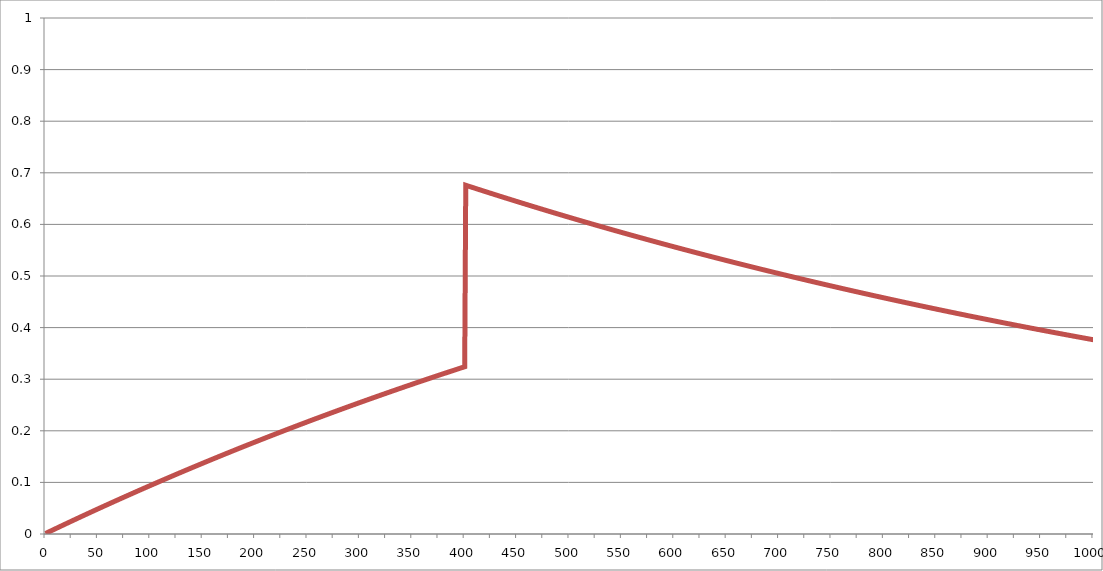
| Category | Series 1 |
|---|---|
| 0.0 | 0.001 |
| 1.0 | 0.002 |
| 2.0 | 0.003 |
| 3.0 | 0.004 |
| 4.0 | 0.005 |
| 5.0 | 0.006 |
| 6.0 | 0.007 |
| 7.0 | 0.008 |
| 8.0 | 0.009 |
| 9.0 | 0.01 |
| 10.0 | 0.011 |
| 11.0 | 0.012 |
| 12.0 | 0.013 |
| 13.0 | 0.014 |
| 14.0 | 0.015 |
| 15.0 | 0.016 |
| 16.0 | 0.016 |
| 17.0 | 0.017 |
| 18.0 | 0.018 |
| 19.0 | 0.019 |
| 20.0 | 0.02 |
| 21.0 | 0.021 |
| 22.0 | 0.022 |
| 23.0 | 0.023 |
| 24.0 | 0.024 |
| 25.0 | 0.025 |
| 26.0 | 0.026 |
| 27.0 | 0.027 |
| 28.0 | 0.028 |
| 29.0 | 0.029 |
| 30.0 | 0.03 |
| 31.0 | 0.031 |
| 32.0 | 0.032 |
| 33.0 | 0.033 |
| 34.0 | 0.034 |
| 35.0 | 0.035 |
| 36.0 | 0.036 |
| 37.0 | 0.036 |
| 38.0 | 0.037 |
| 39.0 | 0.038 |
| 40.0 | 0.039 |
| 41.0 | 0.04 |
| 42.0 | 0.041 |
| 43.0 | 0.042 |
| 44.0 | 0.043 |
| 45.0 | 0.044 |
| 46.0 | 0.045 |
| 47.0 | 0.046 |
| 48.0 | 0.047 |
| 49.0 | 0.048 |
| 50.0 | 0.049 |
| 51.0 | 0.05 |
| 52.0 | 0.05 |
| 53.0 | 0.051 |
| 54.0 | 0.052 |
| 55.0 | 0.053 |
| 56.0 | 0.054 |
| 57.0 | 0.055 |
| 58.0 | 0.056 |
| 59.0 | 0.057 |
| 60.0 | 0.058 |
| 61.0 | 0.059 |
| 62.0 | 0.06 |
| 63.0 | 0.061 |
| 64.0 | 0.062 |
| 65.0 | 0.062 |
| 66.0 | 0.063 |
| 67.0 | 0.064 |
| 68.0 | 0.065 |
| 69.0 | 0.066 |
| 70.0 | 0.067 |
| 71.0 | 0.068 |
| 72.0 | 0.069 |
| 73.0 | 0.07 |
| 74.0 | 0.071 |
| 75.0 | 0.072 |
| 76.0 | 0.072 |
| 77.0 | 0.073 |
| 78.0 | 0.074 |
| 79.0 | 0.075 |
| 80.0 | 0.076 |
| 81.0 | 0.077 |
| 82.0 | 0.078 |
| 83.0 | 0.079 |
| 84.0 | 0.08 |
| 85.0 | 0.081 |
| 86.0 | 0.081 |
| 87.0 | 0.082 |
| 88.0 | 0.083 |
| 89.0 | 0.084 |
| 90.0 | 0.085 |
| 91.0 | 0.086 |
| 92.0 | 0.087 |
| 93.0 | 0.088 |
| 94.0 | 0.089 |
| 95.0 | 0.09 |
| 96.0 | 0.09 |
| 97.0 | 0.091 |
| 98.0 | 0.092 |
| 99.0 | 0.093 |
| 100.0 | 0.094 |
| 101.0 | 0.095 |
| 102.0 | 0.096 |
| 103.0 | 0.097 |
| 104.0 | 0.098 |
| 105.0 | 0.098 |
| 106.0 | 0.099 |
| 107.0 | 0.1 |
| 108.0 | 0.101 |
| 109.0 | 0.102 |
| 110.0 | 0.103 |
| 111.0 | 0.104 |
| 112.0 | 0.105 |
| 113.0 | 0.105 |
| 114.0 | 0.106 |
| 115.0 | 0.107 |
| 116.0 | 0.108 |
| 117.0 | 0.109 |
| 118.0 | 0.11 |
| 119.0 | 0.111 |
| 120.0 | 0.112 |
| 121.0 | 0.112 |
| 122.0 | 0.113 |
| 123.0 | 0.114 |
| 124.0 | 0.115 |
| 125.0 | 0.116 |
| 126.0 | 0.117 |
| 127.0 | 0.118 |
| 128.0 | 0.118 |
| 129.0 | 0.119 |
| 130.0 | 0.12 |
| 131.0 | 0.121 |
| 132.0 | 0.122 |
| 133.0 | 0.123 |
| 134.0 | 0.124 |
| 135.0 | 0.124 |
| 136.0 | 0.125 |
| 137.0 | 0.126 |
| 138.0 | 0.127 |
| 139.0 | 0.128 |
| 140.0 | 0.129 |
| 141.0 | 0.13 |
| 142.0 | 0.13 |
| 143.0 | 0.131 |
| 144.0 | 0.132 |
| 145.0 | 0.133 |
| 146.0 | 0.134 |
| 147.0 | 0.135 |
| 148.0 | 0.135 |
| 149.0 | 0.136 |
| 150.0 | 0.137 |
| 151.0 | 0.138 |
| 152.0 | 0.139 |
| 153.0 | 0.14 |
| 154.0 | 0.141 |
| 155.0 | 0.141 |
| 156.0 | 0.142 |
| 157.0 | 0.143 |
| 158.0 | 0.144 |
| 159.0 | 0.145 |
| 160.0 | 0.146 |
| 161.0 | 0.146 |
| 162.0 | 0.147 |
| 163.0 | 0.148 |
| 164.0 | 0.149 |
| 165.0 | 0.15 |
| 166.0 | 0.151 |
| 167.0 | 0.151 |
| 168.0 | 0.152 |
| 169.0 | 0.153 |
| 170.0 | 0.154 |
| 171.0 | 0.155 |
| 172.0 | 0.156 |
| 173.0 | 0.156 |
| 174.0 | 0.157 |
| 175.0 | 0.158 |
| 176.0 | 0.159 |
| 177.0 | 0.16 |
| 178.0 | 0.16 |
| 179.0 | 0.161 |
| 180.0 | 0.162 |
| 181.0 | 0.163 |
| 182.0 | 0.164 |
| 183.0 | 0.165 |
| 184.0 | 0.165 |
| 185.0 | 0.166 |
| 186.0 | 0.167 |
| 187.0 | 0.168 |
| 188.0 | 0.169 |
| 189.0 | 0.169 |
| 190.0 | 0.17 |
| 191.0 | 0.171 |
| 192.0 | 0.172 |
| 193.0 | 0.173 |
| 194.0 | 0.173 |
| 195.0 | 0.174 |
| 196.0 | 0.175 |
| 197.0 | 0.176 |
| 198.0 | 0.177 |
| 199.0 | 0.178 |
| 200.0 | 0.178 |
| 201.0 | 0.179 |
| 202.0 | 0.18 |
| 203.0 | 0.181 |
| 204.0 | 0.182 |
| 205.0 | 0.182 |
| 206.0 | 0.183 |
| 207.0 | 0.184 |
| 208.0 | 0.185 |
| 209.0 | 0.185 |
| 210.0 | 0.186 |
| 211.0 | 0.187 |
| 212.0 | 0.188 |
| 213.0 | 0.189 |
| 214.0 | 0.189 |
| 215.0 | 0.19 |
| 216.0 | 0.191 |
| 217.0 | 0.192 |
| 218.0 | 0.193 |
| 219.0 | 0.193 |
| 220.0 | 0.194 |
| 221.0 | 0.195 |
| 222.0 | 0.196 |
| 223.0 | 0.197 |
| 224.0 | 0.197 |
| 225.0 | 0.198 |
| 226.0 | 0.199 |
| 227.0 | 0.2 |
| 228.0 | 0.2 |
| 229.0 | 0.201 |
| 230.0 | 0.202 |
| 231.0 | 0.203 |
| 232.0 | 0.204 |
| 233.0 | 0.204 |
| 234.0 | 0.205 |
| 235.0 | 0.206 |
| 236.0 | 0.207 |
| 237.0 | 0.207 |
| 238.0 | 0.208 |
| 239.0 | 0.209 |
| 240.0 | 0.21 |
| 241.0 | 0.211 |
| 242.0 | 0.211 |
| 243.0 | 0.212 |
| 244.0 | 0.213 |
| 245.0 | 0.214 |
| 246.0 | 0.214 |
| 247.0 | 0.215 |
| 248.0 | 0.216 |
| 249.0 | 0.217 |
| 250.0 | 0.217 |
| 251.0 | 0.218 |
| 252.0 | 0.219 |
| 253.0 | 0.22 |
| 254.0 | 0.221 |
| 255.0 | 0.221 |
| 256.0 | 0.222 |
| 257.0 | 0.223 |
| 258.0 | 0.224 |
| 259.0 | 0.224 |
| 260.0 | 0.225 |
| 261.0 | 0.226 |
| 262.0 | 0.227 |
| 263.0 | 0.227 |
| 264.0 | 0.228 |
| 265.0 | 0.229 |
| 266.0 | 0.23 |
| 267.0 | 0.23 |
| 268.0 | 0.231 |
| 269.0 | 0.232 |
| 270.0 | 0.233 |
| 271.0 | 0.233 |
| 272.0 | 0.234 |
| 273.0 | 0.235 |
| 274.0 | 0.236 |
| 275.0 | 0.236 |
| 276.0 | 0.237 |
| 277.0 | 0.238 |
| 278.0 | 0.239 |
| 279.0 | 0.239 |
| 280.0 | 0.24 |
| 281.0 | 0.241 |
| 282.0 | 0.242 |
| 283.0 | 0.242 |
| 284.0 | 0.243 |
| 285.0 | 0.244 |
| 286.0 | 0.245 |
| 287.0 | 0.245 |
| 288.0 | 0.246 |
| 289.0 | 0.247 |
| 290.0 | 0.247 |
| 291.0 | 0.248 |
| 292.0 | 0.249 |
| 293.0 | 0.25 |
| 294.0 | 0.25 |
| 295.0 | 0.251 |
| 296.0 | 0.252 |
| 297.0 | 0.253 |
| 298.0 | 0.253 |
| 299.0 | 0.254 |
| 300.0 | 0.255 |
| 301.0 | 0.256 |
| 302.0 | 0.256 |
| 303.0 | 0.257 |
| 304.0 | 0.258 |
| 305.0 | 0.258 |
| 306.0 | 0.259 |
| 307.0 | 0.26 |
| 308.0 | 0.261 |
| 309.0 | 0.261 |
| 310.0 | 0.262 |
| 311.0 | 0.263 |
| 312.0 | 0.263 |
| 313.0 | 0.264 |
| 314.0 | 0.265 |
| 315.0 | 0.266 |
| 316.0 | 0.266 |
| 317.0 | 0.267 |
| 318.0 | 0.268 |
| 319.0 | 0.268 |
| 320.0 | 0.269 |
| 321.0 | 0.27 |
| 322.0 | 0.271 |
| 323.0 | 0.271 |
| 324.0 | 0.272 |
| 325.0 | 0.273 |
| 326.0 | 0.273 |
| 327.0 | 0.274 |
| 328.0 | 0.275 |
| 329.0 | 0.276 |
| 330.0 | 0.276 |
| 331.0 | 0.277 |
| 332.0 | 0.278 |
| 333.0 | 0.278 |
| 334.0 | 0.279 |
| 335.0 | 0.28 |
| 336.0 | 0.281 |
| 337.0 | 0.281 |
| 338.0 | 0.282 |
| 339.0 | 0.283 |
| 340.0 | 0.283 |
| 341.0 | 0.284 |
| 342.0 | 0.285 |
| 343.0 | 0.285 |
| 344.0 | 0.286 |
| 345.0 | 0.287 |
| 346.0 | 0.288 |
| 347.0 | 0.288 |
| 348.0 | 0.289 |
| 349.0 | 0.29 |
| 350.0 | 0.29 |
| 351.0 | 0.291 |
| 352.0 | 0.292 |
| 353.0 | 0.292 |
| 354.0 | 0.293 |
| 355.0 | 0.294 |
| 356.0 | 0.294 |
| 357.0 | 0.295 |
| 358.0 | 0.296 |
| 359.0 | 0.297 |
| 360.0 | 0.297 |
| 361.0 | 0.298 |
| 362.0 | 0.299 |
| 363.0 | 0.299 |
| 364.0 | 0.3 |
| 365.0 | 0.301 |
| 366.0 | 0.301 |
| 367.0 | 0.302 |
| 368.0 | 0.303 |
| 369.0 | 0.303 |
| 370.0 | 0.304 |
| 371.0 | 0.305 |
| 372.0 | 0.305 |
| 373.0 | 0.306 |
| 374.0 | 0.307 |
| 375.0 | 0.307 |
| 376.0 | 0.308 |
| 377.0 | 0.309 |
| 378.0 | 0.309 |
| 379.0 | 0.31 |
| 380.0 | 0.311 |
| 381.0 | 0.311 |
| 382.0 | 0.312 |
| 383.0 | 0.313 |
| 384.0 | 0.314 |
| 385.0 | 0.314 |
| 386.0 | 0.315 |
| 387.0 | 0.316 |
| 388.0 | 0.316 |
| 389.0 | 0.317 |
| 390.0 | 0.318 |
| 391.0 | 0.318 |
| 392.0 | 0.319 |
| 393.0 | 0.32 |
| 394.0 | 0.32 |
| 395.0 | 0.321 |
| 396.0 | 0.322 |
| 397.0 | 0.322 |
| 398.0 | 0.323 |
| 399.0 | 0.323 |
| 400.0 | 0.324 |
| 401.0 | 0.676 |
| 402.0 | 0.675 |
| 403.0 | 0.675 |
| 404.0 | 0.674 |
| 405.0 | 0.673 |
| 406.0 | 0.673 |
| 407.0 | 0.672 |
| 408.0 | 0.671 |
| 409.0 | 0.671 |
| 410.0 | 0.67 |
| 411.0 | 0.669 |
| 412.0 | 0.669 |
| 413.0 | 0.668 |
| 414.0 | 0.667 |
| 415.0 | 0.667 |
| 416.0 | 0.666 |
| 417.0 | 0.665 |
| 418.0 | 0.665 |
| 419.0 | 0.664 |
| 420.0 | 0.663 |
| 421.0 | 0.663 |
| 422.0 | 0.662 |
| 423.0 | 0.661 |
| 424.0 | 0.661 |
| 425.0 | 0.66 |
| 426.0 | 0.66 |
| 427.0 | 0.659 |
| 428.0 | 0.658 |
| 429.0 | 0.658 |
| 430.0 | 0.657 |
| 431.0 | 0.656 |
| 432.0 | 0.656 |
| 433.0 | 0.655 |
| 434.0 | 0.654 |
| 435.0 | 0.654 |
| 436.0 | 0.653 |
| 437.0 | 0.652 |
| 438.0 | 0.652 |
| 439.0 | 0.651 |
| 440.0 | 0.651 |
| 441.0 | 0.65 |
| 442.0 | 0.649 |
| 443.0 | 0.649 |
| 444.0 | 0.648 |
| 445.0 | 0.647 |
| 446.0 | 0.647 |
| 447.0 | 0.646 |
| 448.0 | 0.646 |
| 449.0 | 0.645 |
| 450.0 | 0.644 |
| 451.0 | 0.644 |
| 452.0 | 0.643 |
| 453.0 | 0.642 |
| 454.0 | 0.642 |
| 455.0 | 0.641 |
| 456.0 | 0.64 |
| 457.0 | 0.64 |
| 458.0 | 0.639 |
| 459.0 | 0.639 |
| 460.0 | 0.638 |
| 461.0 | 0.637 |
| 462.0 | 0.637 |
| 463.0 | 0.636 |
| 464.0 | 0.635 |
| 465.0 | 0.635 |
| 466.0 | 0.634 |
| 467.0 | 0.634 |
| 468.0 | 0.633 |
| 469.0 | 0.632 |
| 470.0 | 0.632 |
| 471.0 | 0.631 |
| 472.0 | 0.631 |
| 473.0 | 0.63 |
| 474.0 | 0.629 |
| 475.0 | 0.629 |
| 476.0 | 0.628 |
| 477.0 | 0.627 |
| 478.0 | 0.627 |
| 479.0 | 0.626 |
| 480.0 | 0.626 |
| 481.0 | 0.625 |
| 482.0 | 0.624 |
| 483.0 | 0.624 |
| 484.0 | 0.623 |
| 485.0 | 0.623 |
| 486.0 | 0.622 |
| 487.0 | 0.621 |
| 488.0 | 0.621 |
| 489.0 | 0.62 |
| 490.0 | 0.62 |
| 491.0 | 0.619 |
| 492.0 | 0.618 |
| 493.0 | 0.618 |
| 494.0 | 0.617 |
| 495.0 | 0.617 |
| 496.0 | 0.616 |
| 497.0 | 0.615 |
| 498.0 | 0.615 |
| 499.0 | 0.614 |
| 500.0 | 0.614 |
| 501.0 | 0.613 |
| 502.0 | 0.612 |
| 503.0 | 0.612 |
| 504.0 | 0.611 |
| 505.0 | 0.611 |
| 506.0 | 0.61 |
| 507.0 | 0.609 |
| 508.0 | 0.609 |
| 509.0 | 0.608 |
| 510.0 | 0.608 |
| 511.0 | 0.607 |
| 512.0 | 0.606 |
| 513.0 | 0.606 |
| 514.0 | 0.605 |
| 515.0 | 0.605 |
| 516.0 | 0.604 |
| 517.0 | 0.603 |
| 518.0 | 0.603 |
| 519.0 | 0.602 |
| 520.0 | 0.602 |
| 521.0 | 0.601 |
| 522.0 | 0.6 |
| 523.0 | 0.6 |
| 524.0 | 0.599 |
| 525.0 | 0.599 |
| 526.0 | 0.598 |
| 527.0 | 0.598 |
| 528.0 | 0.597 |
| 529.0 | 0.596 |
| 530.0 | 0.596 |
| 531.0 | 0.595 |
| 532.0 | 0.595 |
| 533.0 | 0.594 |
| 534.0 | 0.593 |
| 535.0 | 0.593 |
| 536.0 | 0.592 |
| 537.0 | 0.592 |
| 538.0 | 0.591 |
| 539.0 | 0.591 |
| 540.0 | 0.59 |
| 541.0 | 0.589 |
| 542.0 | 0.589 |
| 543.0 | 0.588 |
| 544.0 | 0.588 |
| 545.0 | 0.587 |
| 546.0 | 0.587 |
| 547.0 | 0.586 |
| 548.0 | 0.585 |
| 549.0 | 0.585 |
| 550.0 | 0.584 |
| 551.0 | 0.584 |
| 552.0 | 0.583 |
| 553.0 | 0.583 |
| 554.0 | 0.582 |
| 555.0 | 0.581 |
| 556.0 | 0.581 |
| 557.0 | 0.58 |
| 558.0 | 0.58 |
| 559.0 | 0.579 |
| 560.0 | 0.579 |
| 561.0 | 0.578 |
| 562.0 | 0.577 |
| 563.0 | 0.577 |
| 564.0 | 0.576 |
| 565.0 | 0.576 |
| 566.0 | 0.575 |
| 567.0 | 0.575 |
| 568.0 | 0.574 |
| 569.0 | 0.574 |
| 570.0 | 0.573 |
| 571.0 | 0.572 |
| 572.0 | 0.572 |
| 573.0 | 0.571 |
| 574.0 | 0.571 |
| 575.0 | 0.57 |
| 576.0 | 0.57 |
| 577.0 | 0.569 |
| 578.0 | 0.569 |
| 579.0 | 0.568 |
| 580.0 | 0.567 |
| 581.0 | 0.567 |
| 582.0 | 0.566 |
| 583.0 | 0.566 |
| 584.0 | 0.565 |
| 585.0 | 0.565 |
| 586.0 | 0.564 |
| 587.0 | 0.564 |
| 588.0 | 0.563 |
| 589.0 | 0.562 |
| 590.0 | 0.562 |
| 591.0 | 0.561 |
| 592.0 | 0.561 |
| 593.0 | 0.56 |
| 594.0 | 0.56 |
| 595.0 | 0.559 |
| 596.0 | 0.559 |
| 597.0 | 0.558 |
| 598.0 | 0.558 |
| 599.0 | 0.557 |
| 600.0 | 0.556 |
| 601.0 | 0.556 |
| 602.0 | 0.555 |
| 603.0 | 0.555 |
| 604.0 | 0.554 |
| 605.0 | 0.554 |
| 606.0 | 0.553 |
| 607.0 | 0.553 |
| 608.0 | 0.552 |
| 609.0 | 0.552 |
| 610.0 | 0.551 |
| 611.0 | 0.55 |
| 612.0 | 0.55 |
| 613.0 | 0.549 |
| 614.0 | 0.549 |
| 615.0 | 0.548 |
| 616.0 | 0.548 |
| 617.0 | 0.547 |
| 618.0 | 0.547 |
| 619.0 | 0.546 |
| 620.0 | 0.546 |
| 621.0 | 0.545 |
| 622.0 | 0.545 |
| 623.0 | 0.544 |
| 624.0 | 0.544 |
| 625.0 | 0.543 |
| 626.0 | 0.542 |
| 627.0 | 0.542 |
| 628.0 | 0.541 |
| 629.0 | 0.541 |
| 630.0 | 0.54 |
| 631.0 | 0.54 |
| 632.0 | 0.539 |
| 633.0 | 0.539 |
| 634.0 | 0.538 |
| 635.0 | 0.538 |
| 636.0 | 0.537 |
| 637.0 | 0.537 |
| 638.0 | 0.536 |
| 639.0 | 0.536 |
| 640.0 | 0.535 |
| 641.0 | 0.535 |
| 642.0 | 0.534 |
| 643.0 | 0.534 |
| 644.0 | 0.533 |
| 645.0 | 0.532 |
| 646.0 | 0.532 |
| 647.0 | 0.531 |
| 648.0 | 0.531 |
| 649.0 | 0.53 |
| 650.0 | 0.53 |
| 651.0 | 0.529 |
| 652.0 | 0.529 |
| 653.0 | 0.528 |
| 654.0 | 0.528 |
| 655.0 | 0.527 |
| 656.0 | 0.527 |
| 657.0 | 0.526 |
| 658.0 | 0.526 |
| 659.0 | 0.525 |
| 660.0 | 0.525 |
| 661.0 | 0.524 |
| 662.0 | 0.524 |
| 663.0 | 0.523 |
| 664.0 | 0.523 |
| 665.0 | 0.522 |
| 666.0 | 0.522 |
| 667.0 | 0.521 |
| 668.0 | 0.521 |
| 669.0 | 0.52 |
| 670.0 | 0.52 |
| 671.0 | 0.519 |
| 672.0 | 0.519 |
| 673.0 | 0.518 |
| 674.0 | 0.518 |
| 675.0 | 0.517 |
| 676.0 | 0.517 |
| 677.0 | 0.516 |
| 678.0 | 0.516 |
| 679.0 | 0.515 |
| 680.0 | 0.515 |
| 681.0 | 0.514 |
| 682.0 | 0.514 |
| 683.0 | 0.513 |
| 684.0 | 0.513 |
| 685.0 | 0.512 |
| 686.0 | 0.512 |
| 687.0 | 0.511 |
| 688.0 | 0.511 |
| 689.0 | 0.51 |
| 690.0 | 0.51 |
| 691.0 | 0.509 |
| 692.0 | 0.509 |
| 693.0 | 0.508 |
| 694.0 | 0.508 |
| 695.0 | 0.507 |
| 696.0 | 0.507 |
| 697.0 | 0.506 |
| 698.0 | 0.506 |
| 699.0 | 0.505 |
| 700.0 | 0.505 |
| 701.0 | 0.504 |
| 702.0 | 0.504 |
| 703.0 | 0.503 |
| 704.0 | 0.503 |
| 705.0 | 0.502 |
| 706.0 | 0.502 |
| 707.0 | 0.501 |
| 708.0 | 0.501 |
| 709.0 | 0.5 |
| 710.0 | 0.5 |
| 711.0 | 0.499 |
| 712.0 | 0.499 |
| 713.0 | 0.498 |
| 714.0 | 0.498 |
| 715.0 | 0.497 |
| 716.0 | 0.497 |
| 717.0 | 0.496 |
| 718.0 | 0.496 |
| 719.0 | 0.495 |
| 720.0 | 0.495 |
| 721.0 | 0.494 |
| 722.0 | 0.494 |
| 723.0 | 0.493 |
| 724.0 | 0.493 |
| 725.0 | 0.492 |
| 726.0 | 0.492 |
| 727.0 | 0.491 |
| 728.0 | 0.491 |
| 729.0 | 0.491 |
| 730.0 | 0.49 |
| 731.0 | 0.49 |
| 732.0 | 0.489 |
| 733.0 | 0.489 |
| 734.0 | 0.488 |
| 735.0 | 0.488 |
| 736.0 | 0.487 |
| 737.0 | 0.487 |
| 738.0 | 0.486 |
| 739.0 | 0.486 |
| 740.0 | 0.485 |
| 741.0 | 0.485 |
| 742.0 | 0.484 |
| 743.0 | 0.484 |
| 744.0 | 0.483 |
| 745.0 | 0.483 |
| 746.0 | 0.482 |
| 747.0 | 0.482 |
| 748.0 | 0.482 |
| 749.0 | 0.481 |
| 750.0 | 0.481 |
| 751.0 | 0.48 |
| 752.0 | 0.48 |
| 753.0 | 0.479 |
| 754.0 | 0.479 |
| 755.0 | 0.478 |
| 756.0 | 0.478 |
| 757.0 | 0.477 |
| 758.0 | 0.477 |
| 759.0 | 0.476 |
| 760.0 | 0.476 |
| 761.0 | 0.475 |
| 762.0 | 0.475 |
| 763.0 | 0.475 |
| 764.0 | 0.474 |
| 765.0 | 0.474 |
| 766.0 | 0.473 |
| 767.0 | 0.473 |
| 768.0 | 0.472 |
| 769.0 | 0.472 |
| 770.0 | 0.471 |
| 771.0 | 0.471 |
| 772.0 | 0.47 |
| 773.0 | 0.47 |
| 774.0 | 0.469 |
| 775.0 | 0.469 |
| 776.0 | 0.469 |
| 777.0 | 0.468 |
| 778.0 | 0.468 |
| 779.0 | 0.467 |
| 780.0 | 0.467 |
| 781.0 | 0.466 |
| 782.0 | 0.466 |
| 783.0 | 0.465 |
| 784.0 | 0.465 |
| 785.0 | 0.464 |
| 786.0 | 0.464 |
| 787.0 | 0.464 |
| 788.0 | 0.463 |
| 789.0 | 0.463 |
| 790.0 | 0.462 |
| 791.0 | 0.462 |
| 792.0 | 0.461 |
| 793.0 | 0.461 |
| 794.0 | 0.46 |
| 795.0 | 0.46 |
| 796.0 | 0.459 |
| 797.0 | 0.459 |
| 798.0 | 0.459 |
| 799.0 | 0.458 |
| 800.0 | 0.458 |
| 801.0 | 0.457 |
| 802.0 | 0.457 |
| 803.0 | 0.456 |
| 804.0 | 0.456 |
| 805.0 | 0.455 |
| 806.0 | 0.455 |
| 807.0 | 0.455 |
| 808.0 | 0.454 |
| 809.0 | 0.454 |
| 810.0 | 0.453 |
| 811.0 | 0.453 |
| 812.0 | 0.452 |
| 813.0 | 0.452 |
| 814.0 | 0.451 |
| 815.0 | 0.451 |
| 816.0 | 0.451 |
| 817.0 | 0.45 |
| 818.0 | 0.45 |
| 819.0 | 0.449 |
| 820.0 | 0.449 |
| 821.0 | 0.448 |
| 822.0 | 0.448 |
| 823.0 | 0.447 |
| 824.0 | 0.447 |
| 825.0 | 0.447 |
| 826.0 | 0.446 |
| 827.0 | 0.446 |
| 828.0 | 0.445 |
| 829.0 | 0.445 |
| 830.0 | 0.444 |
| 831.0 | 0.444 |
| 832.0 | 0.444 |
| 833.0 | 0.443 |
| 834.0 | 0.443 |
| 835.0 | 0.442 |
| 836.0 | 0.442 |
| 837.0 | 0.441 |
| 838.0 | 0.441 |
| 839.0 | 0.441 |
| 840.0 | 0.44 |
| 841.0 | 0.44 |
| 842.0 | 0.439 |
| 843.0 | 0.439 |
| 844.0 | 0.438 |
| 845.0 | 0.438 |
| 846.0 | 0.438 |
| 847.0 | 0.437 |
| 848.0 | 0.437 |
| 849.0 | 0.436 |
| 850.0 | 0.436 |
| 851.0 | 0.435 |
| 852.0 | 0.435 |
| 853.0 | 0.435 |
| 854.0 | 0.434 |
| 855.0 | 0.434 |
| 856.0 | 0.433 |
| 857.0 | 0.433 |
| 858.0 | 0.432 |
| 859.0 | 0.432 |
| 860.0 | 0.432 |
| 861.0 | 0.431 |
| 862.0 | 0.431 |
| 863.0 | 0.43 |
| 864.0 | 0.43 |
| 865.0 | 0.429 |
| 866.0 | 0.429 |
| 867.0 | 0.429 |
| 868.0 | 0.428 |
| 869.0 | 0.428 |
| 870.0 | 0.427 |
| 871.0 | 0.427 |
| 872.0 | 0.427 |
| 873.0 | 0.426 |
| 874.0 | 0.426 |
| 875.0 | 0.425 |
| 876.0 | 0.425 |
| 877.0 | 0.424 |
| 878.0 | 0.424 |
| 879.0 | 0.424 |
| 880.0 | 0.423 |
| 881.0 | 0.423 |
| 882.0 | 0.422 |
| 883.0 | 0.422 |
| 884.0 | 0.422 |
| 885.0 | 0.421 |
| 886.0 | 0.421 |
| 887.0 | 0.42 |
| 888.0 | 0.42 |
| 889.0 | 0.42 |
| 890.0 | 0.419 |
| 891.0 | 0.419 |
| 892.0 | 0.418 |
| 893.0 | 0.418 |
| 894.0 | 0.417 |
| 895.0 | 0.417 |
| 896.0 | 0.417 |
| 897.0 | 0.416 |
| 898.0 | 0.416 |
| 899.0 | 0.415 |
| 900.0 | 0.415 |
| 901.0 | 0.415 |
| 902.0 | 0.414 |
| 903.0 | 0.414 |
| 904.0 | 0.413 |
| 905.0 | 0.413 |
| 906.0 | 0.413 |
| 907.0 | 0.412 |
| 908.0 | 0.412 |
| 909.0 | 0.411 |
| 910.0 | 0.411 |
| 911.0 | 0.411 |
| 912.0 | 0.41 |
| 913.0 | 0.41 |
| 914.0 | 0.409 |
| 915.0 | 0.409 |
| 916.0 | 0.409 |
| 917.0 | 0.408 |
| 918.0 | 0.408 |
| 919.0 | 0.407 |
| 920.0 | 0.407 |
| 921.0 | 0.407 |
| 922.0 | 0.406 |
| 923.0 | 0.406 |
| 924.0 | 0.405 |
| 925.0 | 0.405 |
| 926.0 | 0.405 |
| 927.0 | 0.404 |
| 928.0 | 0.404 |
| 929.0 | 0.403 |
| 930.0 | 0.403 |
| 931.0 | 0.403 |
| 932.0 | 0.402 |
| 933.0 | 0.402 |
| 934.0 | 0.401 |
| 935.0 | 0.401 |
| 936.0 | 0.401 |
| 937.0 | 0.4 |
| 938.0 | 0.4 |
| 939.0 | 0.4 |
| 940.0 | 0.399 |
| 941.0 | 0.399 |
| 942.0 | 0.398 |
| 943.0 | 0.398 |
| 944.0 | 0.398 |
| 945.0 | 0.397 |
| 946.0 | 0.397 |
| 947.0 | 0.396 |
| 948.0 | 0.396 |
| 949.0 | 0.396 |
| 950.0 | 0.395 |
| 951.0 | 0.395 |
| 952.0 | 0.394 |
| 953.0 | 0.394 |
| 954.0 | 0.394 |
| 955.0 | 0.393 |
| 956.0 | 0.393 |
| 957.0 | 0.393 |
| 958.0 | 0.392 |
| 959.0 | 0.392 |
| 960.0 | 0.391 |
| 961.0 | 0.391 |
| 962.0 | 0.391 |
| 963.0 | 0.39 |
| 964.0 | 0.39 |
| 965.0 | 0.39 |
| 966.0 | 0.389 |
| 967.0 | 0.389 |
| 968.0 | 0.388 |
| 969.0 | 0.388 |
| 970.0 | 0.388 |
| 971.0 | 0.387 |
| 972.0 | 0.387 |
| 973.0 | 0.386 |
| 974.0 | 0.386 |
| 975.0 | 0.386 |
| 976.0 | 0.385 |
| 977.0 | 0.385 |
| 978.0 | 0.385 |
| 979.0 | 0.384 |
| 980.0 | 0.384 |
| 981.0 | 0.383 |
| 982.0 | 0.383 |
| 983.0 | 0.383 |
| 984.0 | 0.382 |
| 985.0 | 0.382 |
| 986.0 | 0.382 |
| 987.0 | 0.381 |
| 988.0 | 0.381 |
| 989.0 | 0.38 |
| 990.0 | 0.38 |
| 991.0 | 0.38 |
| 992.0 | 0.379 |
| 993.0 | 0.379 |
| 994.0 | 0.379 |
| 995.0 | 0.378 |
| 996.0 | 0.378 |
| 997.0 | 0.378 |
| 998.0 | 0.377 |
| 999.0 | 0.377 |
| 1000.0 | 0.376 |